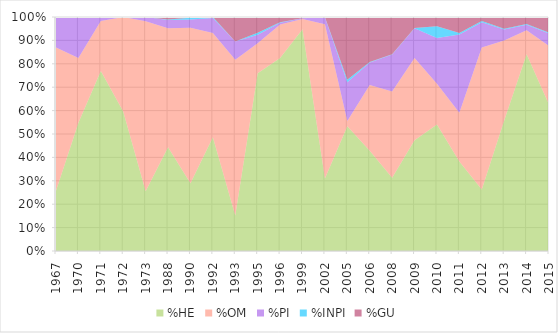
| Category | %HE | %OM | %PI | %INPI | %GU |
|---|---|---|---|---|---|
| 1967.0 | 0.257 | 0.612 | 0.127 | 0.004 | 0 |
| 1970.0 | 0.548 | 0.276 | 0.176 | 0 | 0 |
| 1971.0 | 0.769 | 0.213 | 0.018 | 0 | 0 |
| 1972.0 | 0.596 | 0.404 | 0 | 0 | 0 |
| 1973.0 | 0.256 | 0.726 | 0.018 | 0 | 0 |
| 1988.0 | 0.443 | 0.508 | 0.036 | 0.001 | 0.011 |
| 1990.0 | 0.289 | 0.665 | 0.035 | 0.008 | 0.003 |
| 1992.0 | 0.486 | 0.446 | 0.064 | 0.004 | 0 |
| 1993.0 | 0.152 | 0.665 | 0.078 | 0 | 0.105 |
| 1995.0 | 0.759 | 0.128 | 0.037 | 0.008 | 0.067 |
| 1996.0 | 0.825 | 0.144 | 0.007 | 0.002 | 0.022 |
| 1999.0 | 0.947 | 0.045 | 0.003 | 0 | 0.005 |
| 2002.0 | 0.31 | 0.659 | 0.03 | 0.001 | 0 |
| 2005.0 | 0.533 | 0.023 | 0.166 | 0.011 | 0.268 |
| 2006.0 | 0.428 | 0.281 | 0.096 | 0.002 | 0.192 |
| 2008.0 | 0.313 | 0.369 | 0.157 | 0.002 | 0.159 |
| 2009.0 | 0.473 | 0.352 | 0.127 | 0.002 | 0.047 |
| 2010.0 | 0.54 | 0.174 | 0.195 | 0.051 | 0.039 |
| 2011.0 | 0.382 | 0.209 | 0.335 | 0.006 | 0.069 |
| 2012.0 | 0.263 | 0.607 | 0.108 | 0.005 | 0.017 |
| 2013.0 | 0.558 | 0.342 | 0.047 | 0.003 | 0.051 |
| 2014.0 | 0.841 | 0.102 | 0.023 | 0.003 | 0.03 |
| 2015.0 | 0.627 | 0.25 | 0.053 | 0.003 | 0.067 |